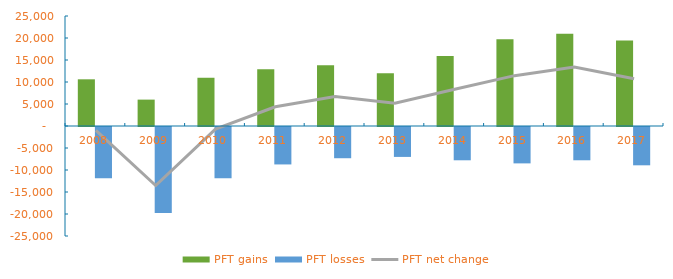
| Category | PFT gains | PFT losses |
|---|---|---|
| 2008.0 | 10612 | -11625 |
| 2009.0 | 5996 | -19519 |
| 2010.0 | 10966 | -11676 |
| 2011.0 | 12870 | -8509 |
| 2012.0 | 13791 | -7097 |
| 2013.0 | 11990 | -6799 |
| 2014.0 | 15935 | -7565 |
| 2015.0 | 19712 | -8269 |
| 2016.0 | 20984 | -7564 |
| 2017.0 | 19445 | -8706 |